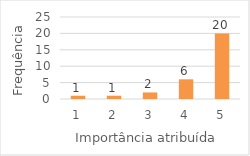
| Category | Series 0 |
|---|---|
| 1.0 | 1 |
| 2.0 | 1 |
| 3.0 | 2 |
| 4.0 | 6 |
| 5.0 | 20 |